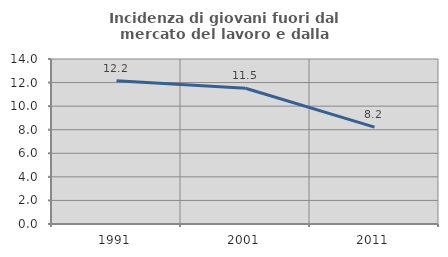
| Category | Incidenza di giovani fuori dal mercato del lavoro e dalla formazione  |
|---|---|
| 1991.0 | 12.155 |
| 2001.0 | 11.515 |
| 2011.0 | 8.223 |